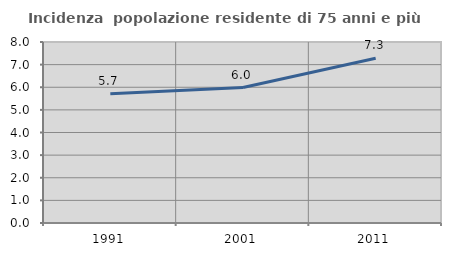
| Category | Incidenza  popolazione residente di 75 anni e più |
|---|---|
| 1991.0 | 5.714 |
| 2001.0 | 5.986 |
| 2011.0 | 7.281 |